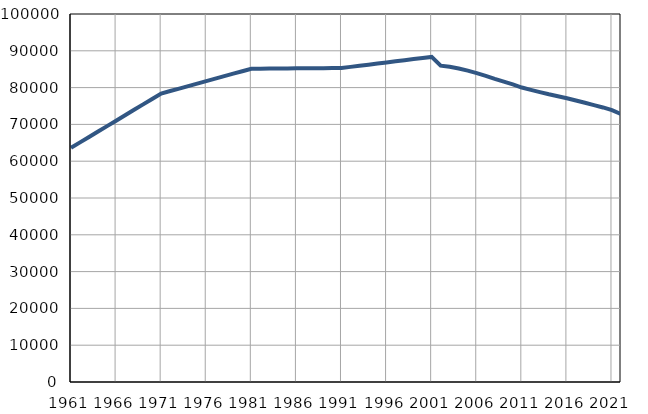
| Category | Population
size |
|---|---|
| 1961.0 | 63634 |
| 1962.0 | 65110 |
| 1963.0 | 66585 |
| 1964.0 | 68061 |
| 1965.0 | 69537 |
| 1966.0 | 71013 |
| 1967.0 | 72488 |
| 1968.0 | 73964 |
| 1969.0 | 75440 |
| 1970.0 | 76915 |
| 1971.0 | 78391 |
| 1972.0 | 79064 |
| 1973.0 | 79739 |
| 1974.0 | 80412 |
| 1975.0 | 81085 |
| 1976.0 | 81760 |
| 1977.0 | 82435 |
| 1978.0 | 83108 |
| 1979.0 | 83781 |
| 1980.0 | 84455 |
| 1981.0 | 85129 |
| 1982.0 | 85149 |
| 1983.0 | 85169 |
| 1984.0 | 85189 |
| 1985.0 | 85209 |
| 1986.0 | 85228 |
| 1987.0 | 85248 |
| 1988.0 | 85268 |
| 1989.0 | 85288 |
| 1990.0 | 85308 |
| 1991.0 | 85328 |
| 1992.0 | 85630 |
| 1993.0 | 85931 |
| 1994.0 | 86232 |
| 1995.0 | 86535 |
| 1996.0 | 86836 |
| 1997.0 | 87138 |
| 1998.0 | 87439 |
| 1999.0 | 87742 |
| 2000.0 | 88043 |
| 2001.0 | 88344 |
| 2002.0 | 85963 |
| 2003.0 | 85653 |
| 2004.0 | 85205 |
| 2005.0 | 84604 |
| 2006.0 | 83939 |
| 2007.0 | 83205 |
| 2008.0 | 82373 |
| 2009.0 | 81613 |
| 2010.0 | 80881 |
| 2011.0 | 80014 |
| 2012.0 | 79385 |
| 2013.0 | 78776 |
| 2014.0 | 78186 |
| 2015.0 | 77667 |
| 2016.0 | 77123 |
| 2017.0 | 76499 |
| 2018.0 | 75873 |
| 2019.0 | 75241 |
| 2020.0 | 74609 |
| 2021.0 | 73884 |
| 2022.0 | 72811 |